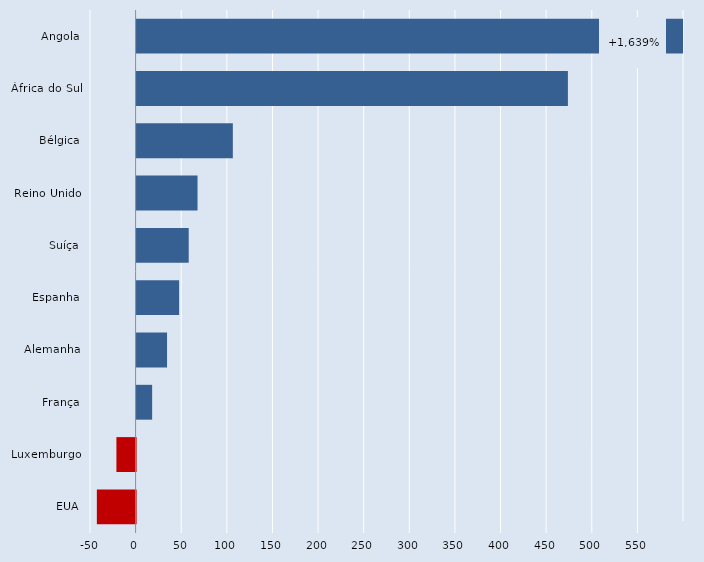
| Category | Series 0 |
|---|---|
| Angola | 750 |
| África do Sul | 472.748 |
| Bélgica | 105.476 |
| Reino Unido | 66.776 |
| Suíça | 57.102 |
| Espanha | 46.607 |
| Alemanha | 33.361 |
| França | 17.021 |
| Luxemburgo | -21.051 |
| EUA | -42.489 |